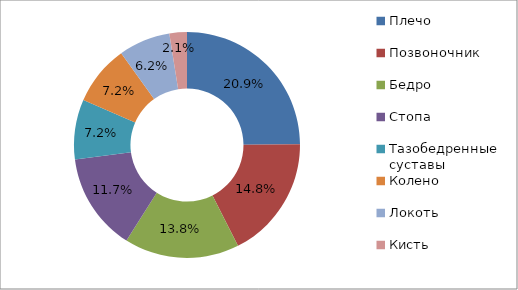
| Category | Series 0 |
|---|---|
| Плечо | 0.209 |
| Позвоночник | 0.148 |
| Бедро | 0.138 |
| Стопа | 0.117 |
| Тазобедренные суставы | 0.072 |
| Колено | 0.072 |
| Локоть | 0.062 |
| Кисть | 0.021 |